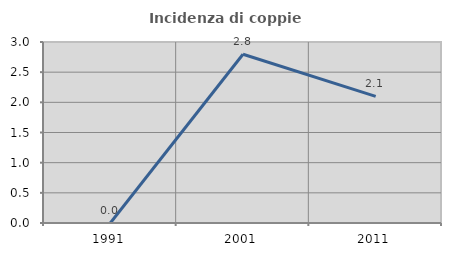
| Category | Incidenza di coppie miste |
|---|---|
| 1991.0 | 0 |
| 2001.0 | 2.797 |
| 2011.0 | 2.098 |